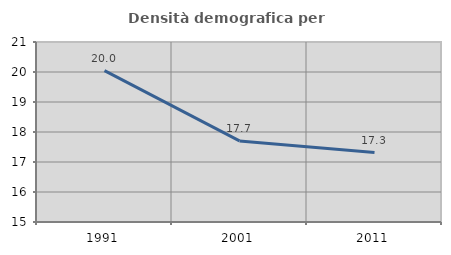
| Category | Densità demografica |
|---|---|
| 1991.0 | 20.047 |
| 2001.0 | 17.704 |
| 2011.0 | 17.316 |